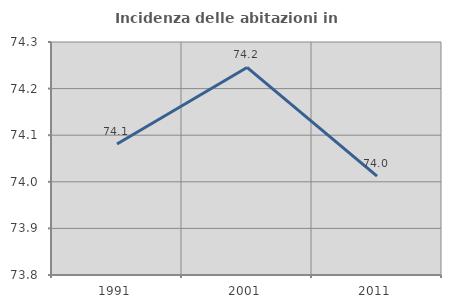
| Category | Incidenza delle abitazioni in proprietà  |
|---|---|
| 1991.0 | 74.081 |
| 2001.0 | 74.245 |
| 2011.0 | 74.012 |